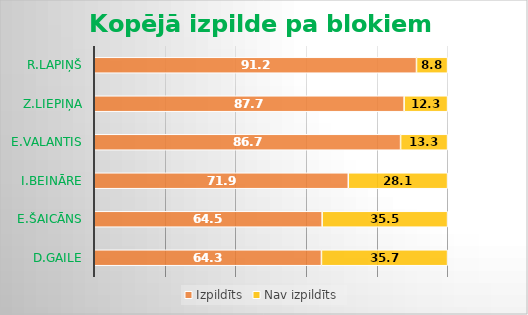
| Category | Izpildīts | Nav izpildīts |
|---|---|---|
| D.Gaile | 64.3 | 35.7 |
| E.Šaicāns | 64.5 | 35.5 |
| I.Beināre | 71.9 | 28.1 |
| E.Valantis | 86.7 | 13.3 |
| Z.Liepiņa | 87.7 | 12.3 |
| R.Lapiņš | 91.2 | 8.8 |